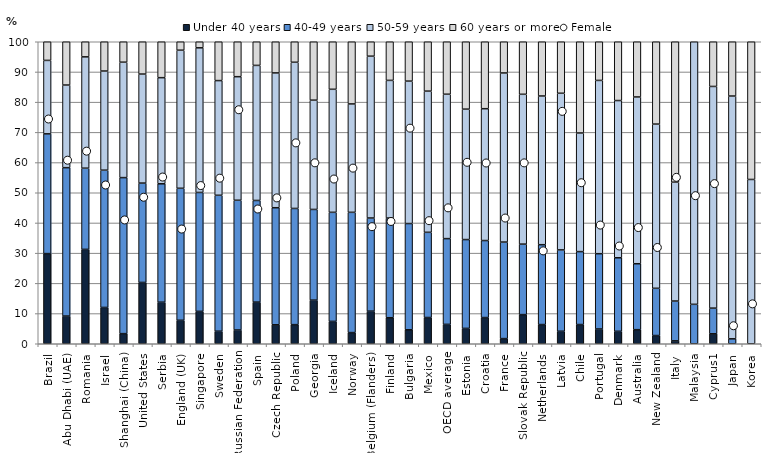
| Category | Under 40 years | 40-49 years | 50-59 years | 60 years or more |
|---|---|---|---|---|
| Brazil | 29.851 | 39.651 | 24.322 | 6.176 |
| Abu Dhabi (UAE) | 9.166 | 49.142 | 27.355 | 14.336 |
| Romania | 31.252 | 26.884 | 36.866 | 4.998 |
| Israel | 12.019 | 45.456 | 32.824 | 9.701 |
| Shanghai (China) | 3.35 | 51.667 | 38.216 | 6.767 |
| United States | 20.3 | 32.9 | 36.1 | 10.7 |
| Serbia | 13.757 | 39.209 | 35.143 | 11.89 |
| England (UK) | 7.773 | 43.71 | 45.721 | 2.796 |
| Singapore | 10.728 | 39.368 | 47.893 | 2.011 |
| Sweden | 4.154 | 45.011 | 37.975 | 12.86 |
| Russian Federation | 4.557 | 42.959 | 40.917 | 11.567 |
| Spain | 13.786 | 33.662 | 44.723 | 7.829 |
| Czech Republic | 6.276 | 38.763 | 44.642 | 10.319 |
| Poland | 6.332 | 38.472 | 48.405 | 6.79 |
| Georgia | 14.443 | 30.031 | 36.182 | 19.343 |
| Iceland | 7.407 | 36.111 | 40.741 | 15.741 |
| Norway | 3.699 | 39.819 | 35.891 | 20.591 |
| Belgium (Flanders) | 10.795 | 30.844 | 53.586 | 4.776 |
| Finland | 8.615 | 33.006 | 45.588 | 12.791 |
| Bulgaria | 4.627 | 35.177 | 47.16 | 13.036 |
| Mexico | 8.692 | 28.212 | 46.746 | 16.35 |
| OECD average | 6.419 | 28.393 | 47.813 | 17.376 |
| Estonia | 5.088 | 29.414 | 43.179 | 22.319 |
| Croatia | 8.675 | 25.502 | 43.655 | 22.168 |
| France | 1.703 | 31.973 | 55.99 | 10.334 |
| Slovak Republic | 9.654 | 23.335 | 49.612 | 17.398 |
| Netherlands | 6.358 | 26.442 | 49.241 | 17.959 |
| Latvia | 4.144 | 26.926 | 51.877 | 17.054 |
| Chile | 6.362 | 24.153 | 39.272 | 30.214 |
| Portugal | 4.886 | 24.935 | 57.379 | 12.8 |
| Denmark | 4.125 | 24.346 | 52.063 | 19.466 |
| Australia | 4.665 | 21.826 | 55.226 | 18.283 |
| New Zealand | 2.722 | 15.641 | 54.374 | 27.263 |
| Italy | 0.953 | 13.189 | 39.353 | 46.506 |
| Malaysia | 0 | 13.057 | 86.943 | 0 |
| Cyprus1 | 3.3 | 8.5 | 73.4 | 14.9 |
| Japan | 0 | 1.634 | 80.391 | 17.974 |
| Korea | 0 | 0 | 54.398 | 45.602 |